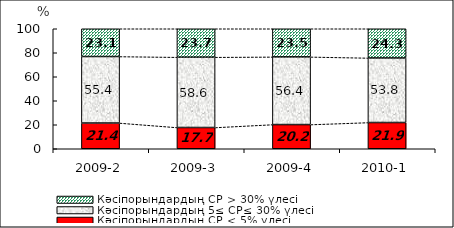
| Category | Кәсіпорындардың СР < 5% үлесі | Кәсіпорындардың 5≤ СР≤ 30% үлесі | Кәсіпорындардың СР > 30% үлесі |
|---|---|---|---|
| 2009-2 | 21.436 | 55.434 | 23.131 |
| 2009-3 | 17.709 | 58.579 | 23.712 |
| 2009-4 | 20.166 | 56.376 | 23.457 |
| 2010-1 | 21.869 | 53.785 | 24.346 |